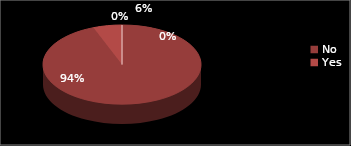
| Category | Series 0 |
|---|---|
| No | 48 |
| Yes | 3 |